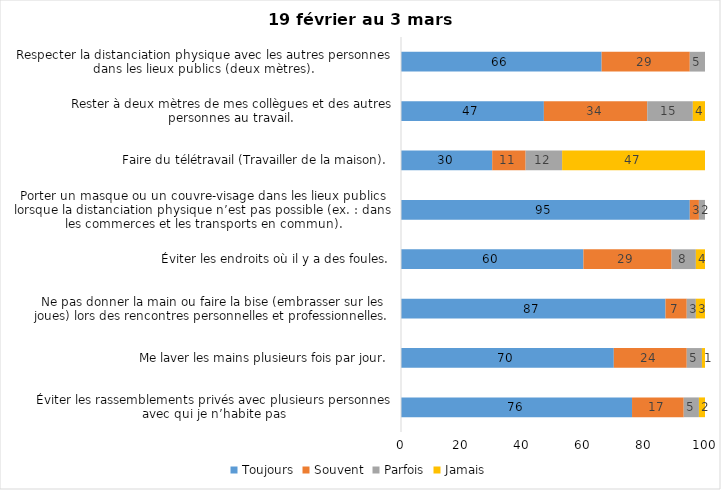
| Category | Toujours | Souvent | Parfois | Jamais |
|---|---|---|---|---|
| Éviter les rassemblements privés avec plusieurs personnes avec qui je n’habite pas | 76 | 17 | 5 | 2 |
| Me laver les mains plusieurs fois par jour. | 70 | 24 | 5 | 1 |
| Ne pas donner la main ou faire la bise (embrasser sur les joues) lors des rencontres personnelles et professionnelles. | 87 | 7 | 3 | 3 |
| Éviter les endroits où il y a des foules. | 60 | 29 | 8 | 4 |
| Porter un masque ou un couvre-visage dans les lieux publics lorsque la distanciation physique n’est pas possible (ex. : dans les commerces et les transports en commun). | 95 | 3 | 2 | 0 |
| Faire du télétravail (Travailler de la maison). | 30 | 11 | 12 | 47 |
| Rester à deux mètres de mes collègues et des autres personnes au travail. | 47 | 34 | 15 | 4 |
| Respecter la distanciation physique avec les autres personnes dans les lieux publics (deux mètres). | 66 | 29 | 5 | 0 |